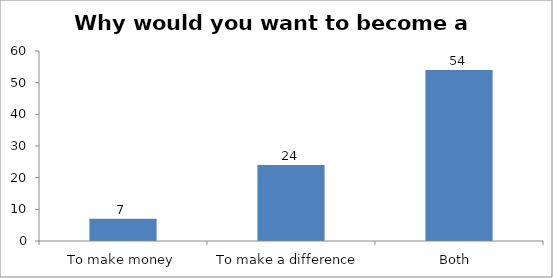
| Category | Why would you want to become a changemaker? |
|---|---|
| To make money | 7 |
| To make a difference  | 24 |
| Both  | 54 |